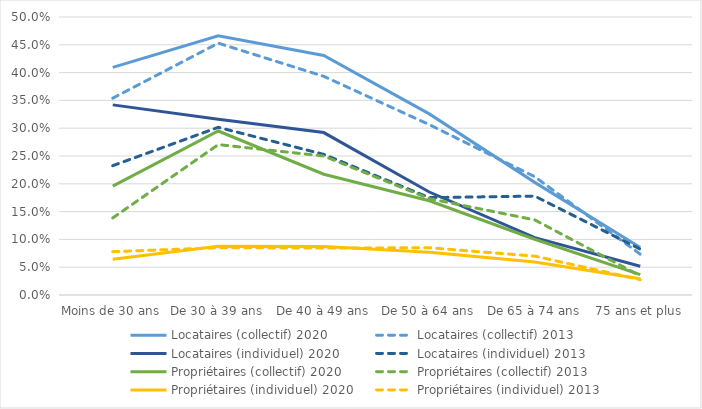
| Category | Locataires (collectif) 2020 | Locataires (collectif) 2013 | Locataires (individuel) 2020 | Locataires (individuel) 2013 | Propriétaires (collectif) 2020 | Propriétaires (collectif) 2013 | Propriétaires (individuel) 2020 | Propriétaires (individuel) 2013 |
|---|---|---|---|---|---|---|---|---|
| Moins de 30 ans | 0.409 | 0.354 | 0.342 | 0.233 | 0.196 | 0.139 | 0.064 | 0.078 |
| De 30 à 39 ans | 0.466 | 0.453 | 0.316 | 0.302 | 0.295 | 0.271 | 0.088 | 0.085 |
| De 40 à 49 ans | 0.431 | 0.393 | 0.292 | 0.253 | 0.217 | 0.25 | 0.087 | 0.084 |
| De 50 à 64 ans | 0.326 | 0.306 | 0.185 | 0.175 | 0.17 | 0.173 | 0.077 | 0.085 |
| De 65 à 74 ans | 0.203 | 0.213 | 0.103 | 0.178 | 0.1 | 0.135 | 0.059 | 0.07 |
| 75 ans et plus | 0.085 | 0.073 | 0.052 | 0.083 | 0.037 | 0.034 | 0.029 | 0.028 |